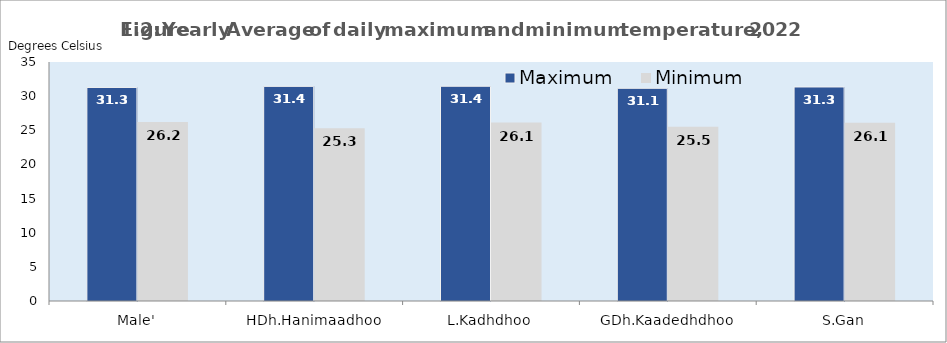
| Category | Maximum | Minimum |
|---|---|---|
| Male' | 31.275 | 26.21 |
| HDh.Hanimaadhoo | 31.431 | 25.291 |
| L.Kadhdhoo | 31.45 | 26.137 |
| GDh.Kaadedhdhoo | 31.149 | 25.512 |
| S.Gan | 31.343 | 26.098 |